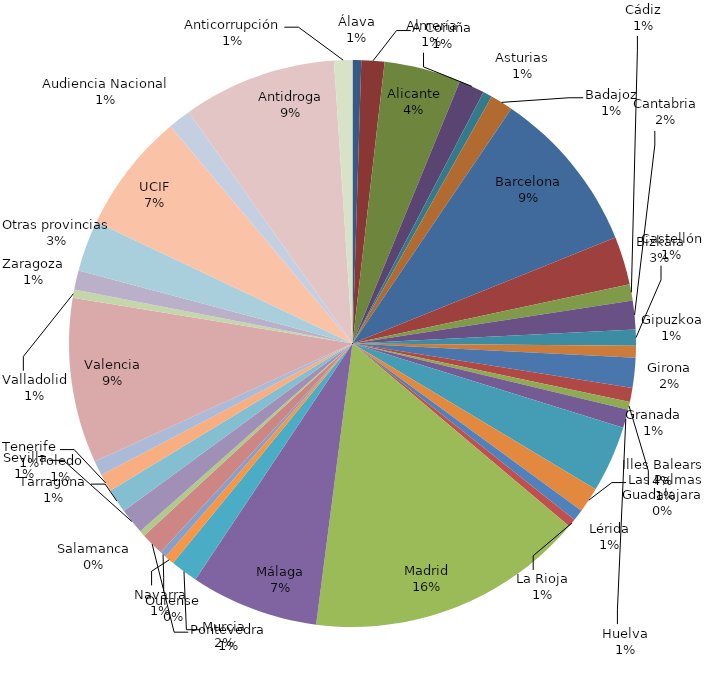
| Category | OEIs y Comisiones Rogatorias |
|---|---|
| Álava | 20 |
| A Coruña | 53 |
| Alicante | 176 |
| Almería | 59 |
| Asturias | 21 |
| Badajoz | 52 |
| Barcelona | 380 |
| Bizkaia | 111 |
| Cádiz | 37 |
| Cantabria | 66 |
| Castellón | 37 |
| Gipuzkoa | 27 |
| Girona | 69 |
| Granada | 32 |
| Guadalajara | 18 |
| Huelva | 42 |
| Illes Balears | 153 |
| Las Palmas | 58 |
| Lérida | 26 |
| La Rioja | 19 |
| Madrid | 640 |
| Málaga | 294 |
| Murcia | 63 |
| Navarra | 22 |
| Ourense | 15 |
| Pontevedra | 53 |
| Salamanca | 13 |
| Sevilla | 59 |
| Tarragona | 55 |
| Tenerife | 41 |
| Toledo | 34 |
| Valencia | 379 |
| Valladolid | 19 |
| Zaragoza | 44 |
| Otras provincias | 117 |
| UCIF | 276 |
| Audiencia Nacional | 52 |
| Antidroga | 353 |
| Anticorrupción | 42 |